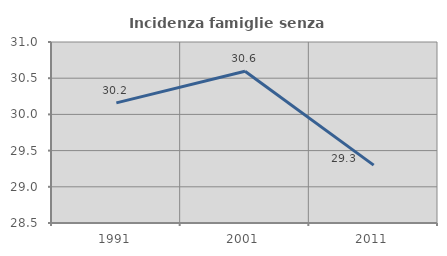
| Category | Incidenza famiglie senza nuclei |
|---|---|
| 1991.0 | 30.159 |
| 2001.0 | 30.597 |
| 2011.0 | 29.299 |